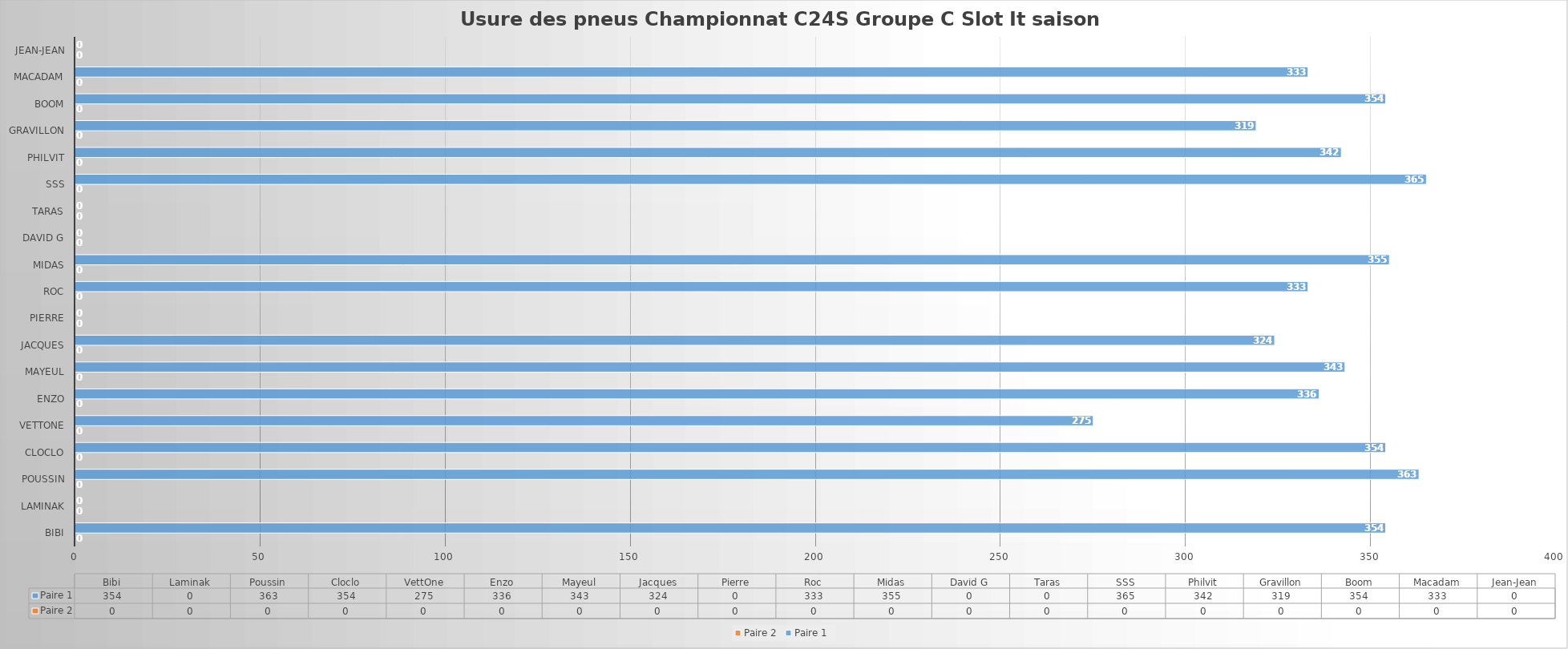
| Category | Paire 2 | Paire 1 |
|---|---|---|
| Bibi | 0 | 354 |
| Laminak | 0 | 0 |
| Poussin | 0 | 363 |
| Cloclo | 0 | 354 |
| VettOne | 0 | 275 |
| Enzo | 0 | 336 |
| Mayeul | 0 | 343 |
| Jacques | 0 | 324 |
| Pierre | 0 | 0 |
| Roc | 0 | 333 |
| Midas | 0 | 355 |
| David G | 0 | 0 |
| Taras | 0 | 0 |
| SSS | 0 | 365 |
| Philvit | 0 | 342 |
| Gravillon | 0 | 319 |
| Boom | 0 | 354 |
| Macadam | 0 | 333 |
| Jean-Jean | 0 | 0 |